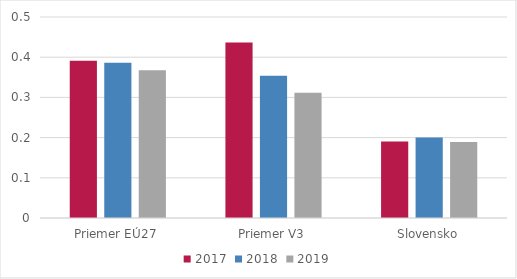
| Category | 2017 | 2018 | 2019 |
|---|---|---|---|
| Priemer EÚ27 | 0.391 | 0.386 | 0.367 |
| Priemer V3 | 0.436 | 0.354 | 0.312 |
| Slovensko | 0.19 | 0.2 | 0.189 |